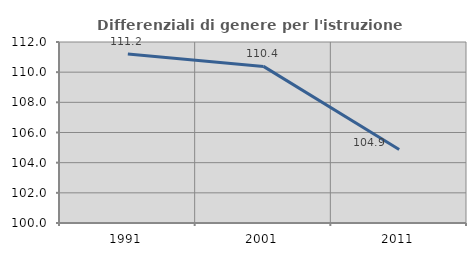
| Category | Differenziali di genere per l'istruzione superiore |
|---|---|
| 1991.0 | 111.21 |
| 2001.0 | 110.382 |
| 2011.0 | 104.878 |